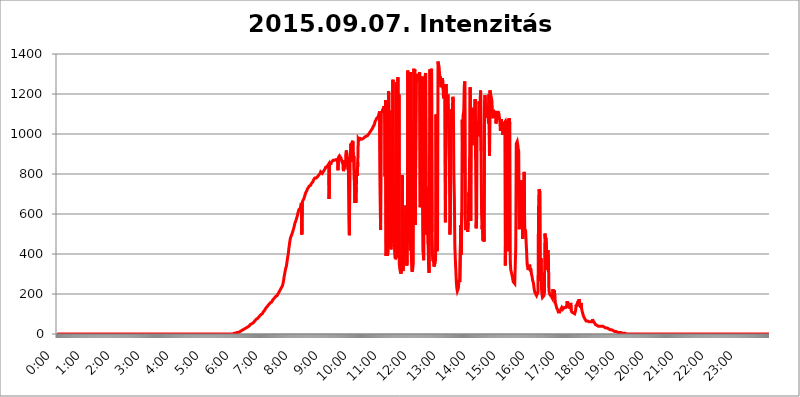
| Category | 2015.09.07. Intenzitás [W/m^2] |
|---|---|
| 0.0 | 0 |
| 0.0006944444444444445 | 0 |
| 0.001388888888888889 | 0 |
| 0.0020833333333333333 | 0 |
| 0.002777777777777778 | 0 |
| 0.003472222222222222 | 0 |
| 0.004166666666666667 | 0 |
| 0.004861111111111111 | 0 |
| 0.005555555555555556 | 0 |
| 0.0062499999999999995 | 0 |
| 0.006944444444444444 | 0 |
| 0.007638888888888889 | 0 |
| 0.008333333333333333 | 0 |
| 0.009027777777777779 | 0 |
| 0.009722222222222222 | 0 |
| 0.010416666666666666 | 0 |
| 0.011111111111111112 | 0 |
| 0.011805555555555555 | 0 |
| 0.012499999999999999 | 0 |
| 0.013194444444444444 | 0 |
| 0.013888888888888888 | 0 |
| 0.014583333333333332 | 0 |
| 0.015277777777777777 | 0 |
| 0.015972222222222224 | 0 |
| 0.016666666666666666 | 0 |
| 0.017361111111111112 | 0 |
| 0.018055555555555557 | 0 |
| 0.01875 | 0 |
| 0.019444444444444445 | 0 |
| 0.02013888888888889 | 0 |
| 0.020833333333333332 | 0 |
| 0.02152777777777778 | 0 |
| 0.022222222222222223 | 0 |
| 0.02291666666666667 | 0 |
| 0.02361111111111111 | 0 |
| 0.024305555555555556 | 0 |
| 0.024999999999999998 | 0 |
| 0.025694444444444447 | 0 |
| 0.02638888888888889 | 0 |
| 0.027083333333333334 | 0 |
| 0.027777777777777776 | 0 |
| 0.02847222222222222 | 0 |
| 0.029166666666666664 | 0 |
| 0.029861111111111113 | 0 |
| 0.030555555555555555 | 0 |
| 0.03125 | 0 |
| 0.03194444444444445 | 0 |
| 0.03263888888888889 | 0 |
| 0.03333333333333333 | 0 |
| 0.034027777777777775 | 0 |
| 0.034722222222222224 | 0 |
| 0.035416666666666666 | 0 |
| 0.036111111111111115 | 0 |
| 0.03680555555555556 | 0 |
| 0.0375 | 0 |
| 0.03819444444444444 | 0 |
| 0.03888888888888889 | 0 |
| 0.03958333333333333 | 0 |
| 0.04027777777777778 | 0 |
| 0.04097222222222222 | 0 |
| 0.041666666666666664 | 0 |
| 0.042361111111111106 | 0 |
| 0.04305555555555556 | 0 |
| 0.043750000000000004 | 0 |
| 0.044444444444444446 | 0 |
| 0.04513888888888889 | 0 |
| 0.04583333333333334 | 0 |
| 0.04652777777777778 | 0 |
| 0.04722222222222222 | 0 |
| 0.04791666666666666 | 0 |
| 0.04861111111111111 | 0 |
| 0.049305555555555554 | 0 |
| 0.049999999999999996 | 0 |
| 0.05069444444444445 | 0 |
| 0.051388888888888894 | 0 |
| 0.052083333333333336 | 0 |
| 0.05277777777777778 | 0 |
| 0.05347222222222222 | 0 |
| 0.05416666666666667 | 0 |
| 0.05486111111111111 | 0 |
| 0.05555555555555555 | 0 |
| 0.05625 | 0 |
| 0.05694444444444444 | 0 |
| 0.057638888888888885 | 0 |
| 0.05833333333333333 | 0 |
| 0.05902777777777778 | 0 |
| 0.059722222222222225 | 0 |
| 0.06041666666666667 | 0 |
| 0.061111111111111116 | 0 |
| 0.06180555555555556 | 0 |
| 0.0625 | 0 |
| 0.06319444444444444 | 0 |
| 0.06388888888888888 | 0 |
| 0.06458333333333334 | 0 |
| 0.06527777777777778 | 0 |
| 0.06597222222222222 | 0 |
| 0.06666666666666667 | 0 |
| 0.06736111111111111 | 0 |
| 0.06805555555555555 | 0 |
| 0.06874999999999999 | 0 |
| 0.06944444444444443 | 0 |
| 0.07013888888888889 | 0 |
| 0.07083333333333333 | 0 |
| 0.07152777777777779 | 0 |
| 0.07222222222222223 | 0 |
| 0.07291666666666667 | 0 |
| 0.07361111111111111 | 0 |
| 0.07430555555555556 | 0 |
| 0.075 | 0 |
| 0.07569444444444444 | 0 |
| 0.0763888888888889 | 0 |
| 0.07708333333333334 | 0 |
| 0.07777777777777778 | 0 |
| 0.07847222222222222 | 0 |
| 0.07916666666666666 | 0 |
| 0.0798611111111111 | 0 |
| 0.08055555555555556 | 0 |
| 0.08125 | 0 |
| 0.08194444444444444 | 0 |
| 0.08263888888888889 | 0 |
| 0.08333333333333333 | 0 |
| 0.08402777777777777 | 0 |
| 0.08472222222222221 | 0 |
| 0.08541666666666665 | 0 |
| 0.08611111111111112 | 0 |
| 0.08680555555555557 | 0 |
| 0.08750000000000001 | 0 |
| 0.08819444444444445 | 0 |
| 0.08888888888888889 | 0 |
| 0.08958333333333333 | 0 |
| 0.09027777777777778 | 0 |
| 0.09097222222222222 | 0 |
| 0.09166666666666667 | 0 |
| 0.09236111111111112 | 0 |
| 0.09305555555555556 | 0 |
| 0.09375 | 0 |
| 0.09444444444444444 | 0 |
| 0.09513888888888888 | 0 |
| 0.09583333333333333 | 0 |
| 0.09652777777777777 | 0 |
| 0.09722222222222222 | 0 |
| 0.09791666666666667 | 0 |
| 0.09861111111111111 | 0 |
| 0.09930555555555555 | 0 |
| 0.09999999999999999 | 0 |
| 0.10069444444444443 | 0 |
| 0.1013888888888889 | 0 |
| 0.10208333333333335 | 0 |
| 0.10277777777777779 | 0 |
| 0.10347222222222223 | 0 |
| 0.10416666666666667 | 0 |
| 0.10486111111111111 | 0 |
| 0.10555555555555556 | 0 |
| 0.10625 | 0 |
| 0.10694444444444444 | 0 |
| 0.1076388888888889 | 0 |
| 0.10833333333333334 | 0 |
| 0.10902777777777778 | 0 |
| 0.10972222222222222 | 0 |
| 0.1111111111111111 | 0 |
| 0.11180555555555556 | 0 |
| 0.11180555555555556 | 0 |
| 0.1125 | 0 |
| 0.11319444444444444 | 0 |
| 0.11388888888888889 | 0 |
| 0.11458333333333333 | 0 |
| 0.11527777777777777 | 0 |
| 0.11597222222222221 | 0 |
| 0.11666666666666665 | 0 |
| 0.1173611111111111 | 0 |
| 0.11805555555555557 | 0 |
| 0.11944444444444445 | 0 |
| 0.12013888888888889 | 0 |
| 0.12083333333333333 | 0 |
| 0.12152777777777778 | 0 |
| 0.12222222222222223 | 0 |
| 0.12291666666666667 | 0 |
| 0.12291666666666667 | 0 |
| 0.12361111111111112 | 0 |
| 0.12430555555555556 | 0 |
| 0.125 | 0 |
| 0.12569444444444444 | 0 |
| 0.12638888888888888 | 0 |
| 0.12708333333333333 | 0 |
| 0.16875 | 0 |
| 0.12847222222222224 | 0 |
| 0.12916666666666668 | 0 |
| 0.12986111111111112 | 0 |
| 0.13055555555555556 | 0 |
| 0.13125 | 0 |
| 0.13194444444444445 | 0 |
| 0.1326388888888889 | 0 |
| 0.13333333333333333 | 0 |
| 0.13402777777777777 | 0 |
| 0.13402777777777777 | 0 |
| 0.13472222222222222 | 0 |
| 0.13541666666666666 | 0 |
| 0.1361111111111111 | 0 |
| 0.13749999999999998 | 0 |
| 0.13819444444444443 | 0 |
| 0.1388888888888889 | 0 |
| 0.13958333333333334 | 0 |
| 0.14027777777777778 | 0 |
| 0.14097222222222222 | 0 |
| 0.14166666666666666 | 0 |
| 0.1423611111111111 | 0 |
| 0.14305555555555557 | 0 |
| 0.14375000000000002 | 0 |
| 0.14444444444444446 | 0 |
| 0.1451388888888889 | 0 |
| 0.1451388888888889 | 0 |
| 0.14652777777777778 | 0 |
| 0.14722222222222223 | 0 |
| 0.14791666666666667 | 0 |
| 0.1486111111111111 | 0 |
| 0.14930555555555555 | 0 |
| 0.15 | 0 |
| 0.15069444444444444 | 0 |
| 0.15138888888888888 | 0 |
| 0.15208333333333332 | 0 |
| 0.15277777777777776 | 0 |
| 0.15347222222222223 | 0 |
| 0.15416666666666667 | 0 |
| 0.15486111111111112 | 0 |
| 0.15555555555555556 | 0 |
| 0.15625 | 0 |
| 0.15694444444444444 | 0 |
| 0.15763888888888888 | 0 |
| 0.15833333333333333 | 0 |
| 0.15902777777777777 | 0 |
| 0.15972222222222224 | 0 |
| 0.16041666666666668 | 0 |
| 0.16111111111111112 | 0 |
| 0.16180555555555556 | 0 |
| 0.1625 | 0 |
| 0.16319444444444445 | 0 |
| 0.1638888888888889 | 0 |
| 0.16458333333333333 | 0 |
| 0.16527777777777777 | 0 |
| 0.16597222222222222 | 0 |
| 0.16666666666666666 | 0 |
| 0.1673611111111111 | 0 |
| 0.16805555555555554 | 0 |
| 0.16874999999999998 | 0 |
| 0.16944444444444443 | 0 |
| 0.17013888888888887 | 0 |
| 0.1708333333333333 | 0 |
| 0.17152777777777775 | 0 |
| 0.17222222222222225 | 0 |
| 0.1729166666666667 | 0 |
| 0.17361111111111113 | 0 |
| 0.17430555555555557 | 0 |
| 0.17500000000000002 | 0 |
| 0.17569444444444446 | 0 |
| 0.1763888888888889 | 0 |
| 0.17708333333333334 | 0 |
| 0.17777777777777778 | 0 |
| 0.17847222222222223 | 0 |
| 0.17916666666666667 | 0 |
| 0.1798611111111111 | 0 |
| 0.18055555555555555 | 0 |
| 0.18125 | 0 |
| 0.18194444444444444 | 0 |
| 0.1826388888888889 | 0 |
| 0.18333333333333335 | 0 |
| 0.1840277777777778 | 0 |
| 0.18472222222222223 | 0 |
| 0.18541666666666667 | 0 |
| 0.18611111111111112 | 0 |
| 0.18680555555555556 | 0 |
| 0.1875 | 0 |
| 0.18819444444444444 | 0 |
| 0.18888888888888888 | 0 |
| 0.18958333333333333 | 0 |
| 0.19027777777777777 | 0 |
| 0.1909722222222222 | 0 |
| 0.19166666666666665 | 0 |
| 0.19236111111111112 | 0 |
| 0.19305555555555554 | 0 |
| 0.19375 | 0 |
| 0.19444444444444445 | 0 |
| 0.1951388888888889 | 0 |
| 0.19583333333333333 | 0 |
| 0.19652777777777777 | 0 |
| 0.19722222222222222 | 0 |
| 0.19791666666666666 | 0 |
| 0.1986111111111111 | 0 |
| 0.19930555555555554 | 0 |
| 0.19999999999999998 | 0 |
| 0.20069444444444443 | 0 |
| 0.20138888888888887 | 0 |
| 0.2020833333333333 | 0 |
| 0.2027777777777778 | 0 |
| 0.2034722222222222 | 0 |
| 0.2041666666666667 | 0 |
| 0.20486111111111113 | 0 |
| 0.20555555555555557 | 0 |
| 0.20625000000000002 | 0 |
| 0.20694444444444446 | 0 |
| 0.2076388888888889 | 0 |
| 0.20833333333333334 | 0 |
| 0.20902777777777778 | 0 |
| 0.20972222222222223 | 0 |
| 0.21041666666666667 | 0 |
| 0.2111111111111111 | 0 |
| 0.21180555555555555 | 0 |
| 0.2125 | 0 |
| 0.21319444444444444 | 0 |
| 0.2138888888888889 | 0 |
| 0.21458333333333335 | 0 |
| 0.2152777777777778 | 0 |
| 0.21597222222222223 | 0 |
| 0.21666666666666667 | 0 |
| 0.21736111111111112 | 0 |
| 0.21805555555555556 | 0 |
| 0.21875 | 0 |
| 0.21944444444444444 | 0 |
| 0.22013888888888888 | 0 |
| 0.22083333333333333 | 0 |
| 0.22152777777777777 | 0 |
| 0.2222222222222222 | 0 |
| 0.22291666666666665 | 0 |
| 0.2236111111111111 | 0 |
| 0.22430555555555556 | 0 |
| 0.225 | 0 |
| 0.22569444444444445 | 0 |
| 0.2263888888888889 | 0 |
| 0.22708333333333333 | 0 |
| 0.22777777777777777 | 0 |
| 0.22847222222222222 | 0 |
| 0.22916666666666666 | 0 |
| 0.2298611111111111 | 0 |
| 0.23055555555555554 | 0 |
| 0.23124999999999998 | 0 |
| 0.23194444444444443 | 0 |
| 0.23263888888888887 | 0 |
| 0.2333333333333333 | 0 |
| 0.2340277777777778 | 0 |
| 0.2347222222222222 | 0 |
| 0.2354166666666667 | 0 |
| 0.23611111111111113 | 0 |
| 0.23680555555555557 | 0 |
| 0.23750000000000002 | 0 |
| 0.23819444444444446 | 0 |
| 0.2388888888888889 | 0 |
| 0.23958333333333334 | 0 |
| 0.24027777777777778 | 0 |
| 0.24097222222222223 | 0 |
| 0.24166666666666667 | 0 |
| 0.2423611111111111 | 0 |
| 0.24305555555555555 | 0 |
| 0.24375 | 0 |
| 0.24444444444444446 | 0 |
| 0.24513888888888888 | 0 |
| 0.24583333333333335 | 0 |
| 0.2465277777777778 | 3.525 |
| 0.24722222222222223 | 0 |
| 0.24791666666666667 | 3.525 |
| 0.24861111111111112 | 3.525 |
| 0.24930555555555556 | 3.525 |
| 0.25 | 3.525 |
| 0.25069444444444444 | 3.525 |
| 0.2513888888888889 | 3.525 |
| 0.2520833333333333 | 7.887 |
| 0.25277777777777777 | 7.887 |
| 0.2534722222222222 | 7.887 |
| 0.25416666666666665 | 7.887 |
| 0.2548611111111111 | 12.257 |
| 0.2555555555555556 | 12.257 |
| 0.25625000000000003 | 12.257 |
| 0.2569444444444445 | 12.257 |
| 0.2576388888888889 | 12.257 |
| 0.25833333333333336 | 16.636 |
| 0.2590277777777778 | 16.636 |
| 0.25972222222222224 | 16.636 |
| 0.2604166666666667 | 21.024 |
| 0.2611111111111111 | 21.024 |
| 0.26180555555555557 | 21.024 |
| 0.2625 | 25.419 |
| 0.26319444444444445 | 25.419 |
| 0.2638888888888889 | 29.823 |
| 0.26458333333333334 | 29.823 |
| 0.2652777777777778 | 29.823 |
| 0.2659722222222222 | 29.823 |
| 0.26666666666666666 | 34.234 |
| 0.2673611111111111 | 34.234 |
| 0.26805555555555555 | 38.653 |
| 0.26875 | 38.653 |
| 0.26944444444444443 | 43.079 |
| 0.2701388888888889 | 43.079 |
| 0.2708333333333333 | 47.511 |
| 0.27152777777777776 | 47.511 |
| 0.2722222222222222 | 47.511 |
| 0.27291666666666664 | 51.951 |
| 0.2736111111111111 | 56.398 |
| 0.2743055555555555 | 56.398 |
| 0.27499999999999997 | 56.398 |
| 0.27569444444444446 | 60.85 |
| 0.27638888888888885 | 60.85 |
| 0.27708333333333335 | 65.31 |
| 0.2777777777777778 | 65.31 |
| 0.27847222222222223 | 69.775 |
| 0.2791666666666667 | 74.246 |
| 0.2798611111111111 | 74.246 |
| 0.28055555555555556 | 78.722 |
| 0.28125 | 78.722 |
| 0.28194444444444444 | 83.205 |
| 0.2826388888888889 | 83.205 |
| 0.2833333333333333 | 87.692 |
| 0.28402777777777777 | 87.692 |
| 0.2847222222222222 | 92.184 |
| 0.28541666666666665 | 96.682 |
| 0.28611111111111115 | 96.682 |
| 0.28680555555555554 | 101.184 |
| 0.28750000000000003 | 101.184 |
| 0.2881944444444445 | 105.69 |
| 0.2888888888888889 | 110.201 |
| 0.28958333333333336 | 110.201 |
| 0.2902777777777778 | 114.716 |
| 0.29097222222222224 | 119.235 |
| 0.2916666666666667 | 123.758 |
| 0.2923611111111111 | 128.284 |
| 0.29305555555555557 | 128.284 |
| 0.29375 | 132.814 |
| 0.29444444444444445 | 137.347 |
| 0.2951388888888889 | 137.347 |
| 0.29583333333333334 | 141.884 |
| 0.2965277777777778 | 146.423 |
| 0.2972222222222222 | 146.423 |
| 0.29791666666666666 | 150.964 |
| 0.2986111111111111 | 155.509 |
| 0.29930555555555555 | 155.509 |
| 0.3 | 160.056 |
| 0.30069444444444443 | 160.056 |
| 0.3013888888888889 | 164.605 |
| 0.3020833333333333 | 169.156 |
| 0.30277777777777776 | 169.156 |
| 0.3034722222222222 | 173.709 |
| 0.30416666666666664 | 178.264 |
| 0.3048611111111111 | 182.82 |
| 0.3055555555555555 | 182.82 |
| 0.30624999999999997 | 187.378 |
| 0.3069444444444444 | 191.937 |
| 0.3076388888888889 | 191.937 |
| 0.30833333333333335 | 191.937 |
| 0.3090277777777778 | 196.497 |
| 0.30972222222222223 | 201.058 |
| 0.3104166666666667 | 205.62 |
| 0.3111111111111111 | 210.182 |
| 0.31180555555555556 | 214.746 |
| 0.3125 | 219.309 |
| 0.31319444444444444 | 223.873 |
| 0.3138888888888889 | 228.436 |
| 0.3145833333333333 | 228.436 |
| 0.31527777777777777 | 233 |
| 0.3159722222222222 | 242.127 |
| 0.31666666666666665 | 246.689 |
| 0.31736111111111115 | 264.932 |
| 0.31805555555555554 | 283.156 |
| 0.31875000000000003 | 296.808 |
| 0.3194444444444445 | 310.44 |
| 0.3201388888888889 | 324.052 |
| 0.32083333333333336 | 333.113 |
| 0.3215277777777778 | 342.162 |
| 0.32222222222222224 | 360.221 |
| 0.3229166666666667 | 378.224 |
| 0.3236111111111111 | 391.685 |
| 0.32430555555555557 | 409.574 |
| 0.325 | 431.833 |
| 0.32569444444444445 | 449.551 |
| 0.3263888888888889 | 467.187 |
| 0.32708333333333334 | 480.356 |
| 0.3277777777777778 | 480.356 |
| 0.3284722222222222 | 493.475 |
| 0.32916666666666666 | 497.836 |
| 0.3298611111111111 | 506.542 |
| 0.33055555555555555 | 515.223 |
| 0.33125 | 519.555 |
| 0.33194444444444443 | 532.513 |
| 0.3326388888888889 | 536.82 |
| 0.3333333333333333 | 553.986 |
| 0.3340277777777778 | 558.261 |
| 0.3347222222222222 | 566.793 |
| 0.3354166666666667 | 575.299 |
| 0.3361111111111111 | 583.779 |
| 0.3368055555555556 | 592.233 |
| 0.33749999999999997 | 604.864 |
| 0.33819444444444446 | 613.252 |
| 0.33888888888888885 | 621.613 |
| 0.33958333333333335 | 625.784 |
| 0.34027777777777773 | 625.784 |
| 0.34097222222222223 | 629.948 |
| 0.3416666666666666 | 642.4 |
| 0.3423611111111111 | 654.791 |
| 0.3430555555555555 | 497.836 |
| 0.34375 | 658.909 |
| 0.3444444444444445 | 667.123 |
| 0.3451388888888889 | 671.22 |
| 0.3458333333333334 | 675.311 |
| 0.34652777777777777 | 683.473 |
| 0.34722222222222227 | 687.544 |
| 0.34791666666666665 | 699.717 |
| 0.34861111111111115 | 707.8 |
| 0.34930555555555554 | 707.8 |
| 0.35000000000000003 | 715.858 |
| 0.3506944444444444 | 723.889 |
| 0.3513888888888889 | 723.889 |
| 0.3520833333333333 | 731.896 |
| 0.3527777777777778 | 735.89 |
| 0.3534722222222222 | 739.877 |
| 0.3541666666666667 | 743.859 |
| 0.3548611111111111 | 743.859 |
| 0.35555555555555557 | 743.859 |
| 0.35625 | 751.803 |
| 0.35694444444444445 | 751.803 |
| 0.3576388888888889 | 755.766 |
| 0.35833333333333334 | 759.723 |
| 0.3590277777777778 | 763.674 |
| 0.3597222222222222 | 771.559 |
| 0.36041666666666666 | 775.492 |
| 0.3611111111111111 | 779.42 |
| 0.36180555555555555 | 775.492 |
| 0.3625 | 775.492 |
| 0.36319444444444443 | 779.42 |
| 0.3638888888888889 | 783.342 |
| 0.3645833333333333 | 783.342 |
| 0.3652777777777778 | 787.258 |
| 0.3659722222222222 | 791.169 |
| 0.3666666666666667 | 795.074 |
| 0.3673611111111111 | 798.974 |
| 0.3680555555555556 | 798.974 |
| 0.36874999999999997 | 802.868 |
| 0.36944444444444446 | 810.641 |
| 0.37013888888888885 | 806.757 |
| 0.37083333333333335 | 810.641 |
| 0.37152777777777773 | 802.868 |
| 0.37222222222222223 | 806.757 |
| 0.3729166666666666 | 810.641 |
| 0.3736111111111111 | 814.519 |
| 0.3743055555555555 | 818.392 |
| 0.375 | 822.26 |
| 0.3756944444444445 | 826.123 |
| 0.3763888888888889 | 833.834 |
| 0.3770833333333334 | 829.981 |
| 0.37777777777777777 | 829.981 |
| 0.37847222222222227 | 837.682 |
| 0.37916666666666665 | 837.682 |
| 0.37986111111111115 | 841.526 |
| 0.38055555555555554 | 849.199 |
| 0.38125000000000003 | 675.311 |
| 0.3819444444444444 | 853.029 |
| 0.3826388888888889 | 853.029 |
| 0.3833333333333333 | 853.029 |
| 0.3840277777777778 | 853.029 |
| 0.3847222222222222 | 860.676 |
| 0.3854166666666667 | 864.493 |
| 0.3861111111111111 | 864.493 |
| 0.38680555555555557 | 868.305 |
| 0.3875 | 868.305 |
| 0.38819444444444445 | 868.305 |
| 0.3888888888888889 | 868.305 |
| 0.38958333333333334 | 872.114 |
| 0.3902777777777778 | 872.114 |
| 0.3909722222222222 | 872.114 |
| 0.39166666666666666 | 872.114 |
| 0.3923611111111111 | 872.114 |
| 0.39305555555555555 | 872.114 |
| 0.39375 | 818.392 |
| 0.39444444444444443 | 883.516 |
| 0.3951388888888889 | 887.309 |
| 0.3958333333333333 | 891.099 |
| 0.3965277777777778 | 887.309 |
| 0.3972222222222222 | 887.309 |
| 0.3979166666666667 | 879.719 |
| 0.3986111111111111 | 883.516 |
| 0.3993055555555556 | 879.719 |
| 0.39999999999999997 | 853.029 |
| 0.40069444444444446 | 868.305 |
| 0.40138888888888885 | 814.519 |
| 0.40208333333333335 | 826.123 |
| 0.40277777777777773 | 849.199 |
| 0.40347222222222223 | 853.029 |
| 0.4041666666666666 | 841.526 |
| 0.4048611111111111 | 906.223 |
| 0.4055555555555555 | 917.534 |
| 0.40625 | 887.309 |
| 0.4069444444444445 | 887.309 |
| 0.4076388888888889 | 879.719 |
| 0.4083333333333334 | 826.123 |
| 0.40902777777777777 | 575.299 |
| 0.40972222222222227 | 493.475 |
| 0.41041666666666665 | 879.719 |
| 0.41111111111111115 | 902.447 |
| 0.41180555555555554 | 951.327 |
| 0.41250000000000003 | 860.676 |
| 0.4131944444444444 | 955.071 |
| 0.4138888888888889 | 955.071 |
| 0.4145833333333333 | 966.295 |
| 0.4152777777777778 | 864.493 |
| 0.4159722222222222 | 891.099 |
| 0.4166666666666667 | 771.559 |
| 0.4173611111111111 | 654.791 |
| 0.41805555555555557 | 723.889 |
| 0.41875 | 654.791 |
| 0.41944444444444445 | 735.89 |
| 0.4201388888888889 | 822.26 |
| 0.42083333333333334 | 791.169 |
| 0.4215277777777778 | 860.676 |
| 0.4222222222222222 | 977.508 |
| 0.42291666666666666 | 977.508 |
| 0.4236111111111111 | 970.034 |
| 0.42430555555555555 | 970.034 |
| 0.425 | 977.508 |
| 0.42569444444444443 | 977.508 |
| 0.4263888888888889 | 973.772 |
| 0.4270833333333333 | 973.772 |
| 0.4277777777777778 | 977.508 |
| 0.4284722222222222 | 977.508 |
| 0.4291666666666667 | 977.508 |
| 0.4298611111111111 | 977.508 |
| 0.4305555555555556 | 981.244 |
| 0.43124999999999997 | 984.98 |
| 0.43194444444444446 | 981.244 |
| 0.43263888888888885 | 984.98 |
| 0.43333333333333335 | 988.714 |
| 0.43402777777777773 | 988.714 |
| 0.43472222222222223 | 992.448 |
| 0.4354166666666666 | 992.448 |
| 0.4361111111111111 | 996.182 |
| 0.4368055555555555 | 999.916 |
| 0.4375 | 1003.65 |
| 0.4381944444444445 | 1007.383 |
| 0.4388888888888889 | 1011.118 |
| 0.4395833333333334 | 1014.852 |
| 0.44027777777777777 | 1018.587 |
| 0.44097222222222227 | 1022.323 |
| 0.44166666666666665 | 1026.06 |
| 0.44236111111111115 | 1029.798 |
| 0.44305555555555554 | 1037.277 |
| 0.44375000000000003 | 1041.019 |
| 0.4444444444444444 | 1044.762 |
| 0.4451388888888889 | 1052.255 |
| 0.4458333333333333 | 1063.51 |
| 0.4465277777777778 | 1059.756 |
| 0.4472222222222222 | 1071.027 |
| 0.4479166666666667 | 1078.555 |
| 0.4486111111111111 | 1074.789 |
| 0.44930555555555557 | 1078.555 |
| 0.45 | 1086.097 |
| 0.45069444444444445 | 1093.653 |
| 0.4513888888888889 | 1097.437 |
| 0.45208333333333334 | 1112.618 |
| 0.4527777777777778 | 1108.816 |
| 0.4534722222222222 | 519.555 |
| 0.45416666666666666 | 1105.019 |
| 0.4548611111111111 | 1105.019 |
| 0.45555555555555555 | 1112.618 |
| 0.45625 | 1120.238 |
| 0.45694444444444443 | 1120.238 |
| 0.4576388888888889 | 1127.879 |
| 0.4583333333333333 | 1139.384 |
| 0.4590277777777778 | 1097.437 |
| 0.4597222222222222 | 787.258 |
| 0.4604166666666667 | 1170.358 |
| 0.4611111111111111 | 391.685 |
| 0.4618055555555556 | 405.108 |
| 0.46249999999999997 | 445.129 |
| 0.46319444444444446 | 391.685 |
| 0.46388888888888885 | 418.492 |
| 0.46458333333333335 | 1213.804 |
| 0.46527777777777773 | 1197.876 |
| 0.46597222222222223 | 475.972 |
| 0.4666666666666666 | 1116.426 |
| 0.4673611111111111 | 440.702 |
| 0.4680555555555555 | 422.943 |
| 0.46875 | 462.786 |
| 0.4694444444444445 | 497.836 |
| 0.4701388888888889 | 484.735 |
| 0.4708333333333334 | 1270.964 |
| 0.47152777777777777 | 642.4 |
| 0.47222222222222227 | 484.735 |
| 0.47291666666666665 | 484.735 |
| 0.47361111111111115 | 387.202 |
| 0.47430555555555554 | 373.729 |
| 0.47500000000000003 | 382.715 |
| 0.4756944444444444 | 1258.511 |
| 0.4763888888888889 | 382.715 |
| 0.4770833333333333 | 409.574 |
| 0.4777777777777778 | 1283.541 |
| 0.4784722222222222 | 484.735 |
| 0.4791666666666667 | 1197.876 |
| 0.4798611111111111 | 346.682 |
| 0.48055555555555557 | 324.052 |
| 0.48125 | 310.44 |
| 0.48194444444444445 | 301.354 |
| 0.4826388888888889 | 296.808 |
| 0.48333333333333334 | 324.052 |
| 0.4840277777777778 | 795.074 |
| 0.4847222222222222 | 314.98 |
| 0.48541666666666666 | 333.113 |
| 0.4861111111111111 | 400.638 |
| 0.48680555555555555 | 510.885 |
| 0.4875 | 396.164 |
| 0.48819444444444443 | 545.416 |
| 0.4888888888888889 | 642.4 |
| 0.4895833333333333 | 378.224 |
| 0.4902777777777778 | 342.162 |
| 0.4909722222222222 | 369.23 |
| 0.4916666666666667 | 1317.736 |
| 0.4923611111111111 | 675.311 |
| 0.4930555555555556 | 462.786 |
| 0.49374999999999997 | 687.544 |
| 0.49444444444444446 | 480.356 |
| 0.49513888888888885 | 418.492 |
| 0.49583333333333335 | 1309.093 |
| 0.49652777777777773 | 414.035 |
| 0.49722222222222223 | 319.517 |
| 0.4979166666666666 | 310.44 |
| 0.4986111111111111 | 328.584 |
| 0.4993055555555555 | 351.198 |
| 0.5 | 1326.445 |
| 0.5006944444444444 | 1291.997 |
| 0.5013888888888889 | 1322.082 |
| 0.5020833333333333 | 545.416 |
| 0.5027777777777778 | 549.704 |
| 0.5034722222222222 | 1300.514 |
| 0.5041666666666667 | 1283.541 |
| 0.5048611111111111 | 1270.964 |
| 0.5055555555555555 | 1275.142 |
| 0.50625 | 1270.964 |
| 0.5069444444444444 | 1283.541 |
| 0.5076388888888889 | 1300.514 |
| 0.5083333333333333 | 1309.093 |
| 0.5090277777777777 | 634.105 |
| 0.5097222222222222 | 658.909 |
| 0.5104166666666666 | 1266.8 |
| 0.5111111111111112 | 1287.761 |
| 0.5118055555555555 | 1287.761 |
| 0.5125000000000001 | 1287.761 |
| 0.5131944444444444 | 409.574 |
| 0.513888888888889 | 369.23 |
| 0.5145833333333333 | 1275.142 |
| 0.5152777777777778 | 1283.541 |
| 0.5159722222222222 | 1291.997 |
| 0.5166666666666667 | 1304.795 |
| 0.517361111111111 | 604.864 |
| 0.5180555555555556 | 497.836 |
| 0.5187499999999999 | 634.105 |
| 0.5194444444444445 | 735.89 |
| 0.5201388888888888 | 449.551 |
| 0.5208333333333334 | 342.162 |
| 0.5215277777777778 | 305.898 |
| 0.5222222222222223 | 301.354 |
| 0.5229166666666667 | 1322.082 |
| 0.5236111111111111 | 1022.323 |
| 0.5243055555555556 | 1313.406 |
| 0.525 | 1326.445 |
| 0.5256944444444445 | 510.885 |
| 0.5263888888888889 | 387.202 |
| 0.5270833333333333 | 364.728 |
| 0.5277777777777778 | 387.202 |
| 0.5284722222222222 | 337.639 |
| 0.5291666666666667 | 337.639 |
| 0.5298611111111111 | 355.712 |
| 0.5305555555555556 | 369.23 |
| 0.53125 | 1097.437 |
| 0.5319444444444444 | 440.702 |
| 0.5326388888888889 | 414.035 |
| 0.5333333333333333 | 427.39 |
| 0.5340277777777778 | 1361.991 |
| 0.5347222222222222 | 1348.524 |
| 0.5354166666666667 | 1339.639 |
| 0.5361111111111111 | 1304.795 |
| 0.5368055555555555 | 1279.334 |
| 0.5375 | 1287.761 |
| 0.5381944444444444 | 1233.951 |
| 0.5388888888888889 | 1238.014 |
| 0.5395833333333333 | 1246.176 |
| 0.5402777777777777 | 1279.334 |
| 0.5409722222222222 | 1242.089 |
| 0.5416666666666666 | 1178.177 |
| 0.5423611111111112 | 1201.843 |
| 0.5430555555555555 | 1229.899 |
| 0.5437500000000001 | 1242.089 |
| 0.5444444444444444 | 558.261 |
| 0.545138888888889 | 1250.275 |
| 0.5458333333333333 | 1178.177 |
| 0.5465277777777778 | 1120.238 |
| 0.5472222222222222 | 1150.946 |
| 0.5479166666666667 | 1197.876 |
| 0.548611111111111 | 1074.789 |
| 0.5493055555555556 | 940.082 |
| 0.5499999999999999 | 860.676 |
| 0.5506944444444445 | 497.836 |
| 0.5513888888888888 | 592.233 |
| 0.5520833333333334 | 981.244 |
| 0.5527777777777778 | 1124.056 |
| 0.5534722222222223 | 1116.426 |
| 0.5541666666666667 | 1124.056 |
| 0.5548611111111111 | 1186.03 |
| 0.5555555555555556 | 1158.689 |
| 0.55625 | 798.974 |
| 0.5569444444444445 | 687.544 |
| 0.5576388888888889 | 440.702 |
| 0.5583333333333333 | 373.729 |
| 0.5590277777777778 | 319.517 |
| 0.5597222222222222 | 260.373 |
| 0.5604166666666667 | 228.436 |
| 0.5611111111111111 | 214.746 |
| 0.5618055555555556 | 214.746 |
| 0.5625 | 228.436 |
| 0.5631944444444444 | 255.813 |
| 0.5638888888888889 | 269.49 |
| 0.5645833333333333 | 260.373 |
| 0.5652777777777778 | 260.373 |
| 0.5659722222222222 | 545.416 |
| 0.5666666666666667 | 396.164 |
| 0.5673611111111111 | 609.062 |
| 0.5680555555555555 | 1071.027 |
| 0.56875 | 806.757 |
| 0.5694444444444444 | 1097.437 |
| 0.5701388888888889 | 1116.426 |
| 0.5708333333333333 | 1238.014 |
| 0.5715277777777777 | 1262.649 |
| 0.5722222222222222 | 596.45 |
| 0.5729166666666666 | 519.555 |
| 0.5736111111111112 | 519.555 |
| 0.5743055555555555 | 553.986 |
| 0.5750000000000001 | 536.82 |
| 0.5756944444444444 | 510.885 |
| 0.576388888888889 | 553.986 |
| 0.5770833333333333 | 707.8 |
| 0.5777777777777778 | 683.473 |
| 0.5784722222222222 | 879.719 |
| 0.5791666666666667 | 1233.951 |
| 0.579861111111111 | 566.793 |
| 0.5805555555555556 | 1131.708 |
| 0.5812499999999999 | 1022.323 |
| 0.5819444444444445 | 943.832 |
| 0.5826388888888888 | 1048.508 |
| 0.5833333333333334 | 1127.879 |
| 0.5840277777777778 | 1022.323 |
| 0.5847222222222223 | 1093.653 |
| 0.5854166666666667 | 996.182 |
| 0.5861111111111111 | 1174.263 |
| 0.5868055555555556 | 875.918 |
| 0.5875 | 528.2 |
| 0.5881944444444445 | 583.779 |
| 0.5888888888888889 | 1063.51 |
| 0.5895833333333333 | 1044.762 |
| 0.5902777777777778 | 1033.537 |
| 0.5909722222222222 | 988.714 |
| 0.5916666666666667 | 1162.571 |
| 0.5923611111111111 | 1139.384 |
| 0.5930555555555556 | 1154.814 |
| 0.59375 | 1217.812 |
| 0.5944444444444444 | 913.766 |
| 0.5951388888888889 | 604.864 |
| 0.5958333333333333 | 523.88 |
| 0.5965277777777778 | 558.261 |
| 0.5972222222222222 | 467.187 |
| 0.5979166666666667 | 532.513 |
| 0.5986111111111111 | 462.786 |
| 0.5993055555555555 | 1162.571 |
| 0.6 | 1193.918 |
| 0.6006944444444444 | 1124.056 |
| 0.6013888888888889 | 1089.873 |
| 0.6020833333333333 | 1082.324 |
| 0.6027777777777777 | 1143.232 |
| 0.6034722222222222 | 1147.086 |
| 0.6041666666666666 | 1086.097 |
| 0.6048611111111112 | 1052.255 |
| 0.6055555555555555 | 1197.876 |
| 0.6062500000000001 | 891.099 |
| 0.6069444444444444 | 1217.812 |
| 0.607638888888889 | 1201.843 |
| 0.6083333333333333 | 1197.876 |
| 0.6090277777777778 | 1178.177 |
| 0.6097222222222222 | 1162.571 |
| 0.6104166666666667 | 1093.653 |
| 0.611111111111111 | 1078.555 |
| 0.6118055555555556 | 1120.238 |
| 0.6124999999999999 | 1112.618 |
| 0.6131944444444445 | 1097.437 |
| 0.6138888888888888 | 1112.618 |
| 0.6145833333333334 | 1101.226 |
| 0.6152777777777778 | 1052.255 |
| 0.6159722222222223 | 1067.267 |
| 0.6166666666666667 | 1108.816 |
| 0.6173611111111111 | 1112.618 |
| 0.6180555555555556 | 1112.618 |
| 0.61875 | 1108.816 |
| 0.6194444444444445 | 1101.226 |
| 0.6201388888888889 | 1101.226 |
| 0.6208333333333333 | 1059.756 |
| 0.6215277777777778 | 1014.852 |
| 0.6222222222222222 | 1048.508 |
| 0.6229166666666667 | 1074.789 |
| 0.6236111111111111 | 1018.587 |
| 0.6243055555555556 | 1056.004 |
| 0.625 | 996.182 |
| 0.6256944444444444 | 1037.277 |
| 0.6263888888888889 | 1052.255 |
| 0.6270833333333333 | 1052.255 |
| 0.6277777777777778 | 1059.756 |
| 0.6284722222222222 | 342.162 |
| 0.6291666666666667 | 337.639 |
| 0.6298611111111111 | 1063.51 |
| 0.6305555555555555 | 1056.004 |
| 0.63125 | 767.62 |
| 0.6319444444444444 | 1067.267 |
| 0.6326388888888889 | 1074.789 |
| 0.6333333333333333 | 414.035 |
| 0.6340277777777777 | 1078.555 |
| 0.6347222222222222 | 1048.508 |
| 0.6354166666666666 | 360.221 |
| 0.6361111111111112 | 319.517 |
| 0.6368055555555555 | 310.44 |
| 0.6375000000000001 | 305.898 |
| 0.6381944444444444 | 287.709 |
| 0.638888888888889 | 274.047 |
| 0.6395833333333333 | 260.373 |
| 0.6402777777777778 | 260.373 |
| 0.6409722222222222 | 255.813 |
| 0.6416666666666667 | 251.251 |
| 0.642361111111111 | 251.251 |
| 0.6430555555555556 | 431.833 |
| 0.6437499999999999 | 951.327 |
| 0.6444444444444445 | 947.58 |
| 0.6451388888888888 | 962.555 |
| 0.6458333333333334 | 947.58 |
| 0.6465277777777778 | 928.819 |
| 0.6472222222222223 | 913.766 |
| 0.6479166666666667 | 523.88 |
| 0.6486111111111111 | 553.986 |
| 0.6493055555555556 | 646.537 |
| 0.65 | 562.53 |
| 0.6506944444444445 | 767.62 |
| 0.6513888888888889 | 600.661 |
| 0.6520833333333333 | 629.948 |
| 0.6527777777777778 | 475.972 |
| 0.6534722222222222 | 506.542 |
| 0.6541666666666667 | 695.666 |
| 0.6548611111111111 | 810.641 |
| 0.6555555555555556 | 528.2 |
| 0.65625 | 532.513 |
| 0.6569444444444444 | 515.223 |
| 0.6576388888888889 | 458.38 |
| 0.6583333333333333 | 409.574 |
| 0.6590277777777778 | 351.198 |
| 0.6597222222222222 | 351.198 |
| 0.6604166666666667 | 319.517 |
| 0.6611111111111111 | 324.052 |
| 0.6618055555555555 | 333.113 |
| 0.6625 | 346.682 |
| 0.6631944444444444 | 319.517 |
| 0.6638888888888889 | 328.584 |
| 0.6645833333333333 | 310.44 |
| 0.6652777777777777 | 296.808 |
| 0.6659722222222222 | 287.709 |
| 0.6666666666666666 | 269.49 |
| 0.6673611111111111 | 269.49 |
| 0.6680555555555556 | 251.251 |
| 0.6687500000000001 | 228.436 |
| 0.6694444444444444 | 214.746 |
| 0.6701388888888888 | 205.62 |
| 0.6708333333333334 | 201.058 |
| 0.6715277777777778 | 201.058 |
| 0.6722222222222222 | 191.937 |
| 0.6729166666666666 | 187.378 |
| 0.6736111111111112 | 191.937 |
| 0.6743055555555556 | 210.182 |
| 0.6749999999999999 | 617.436 |
| 0.6756944444444444 | 723.889 |
| 0.6763888888888889 | 719.877 |
| 0.6770833333333334 | 707.8 |
| 0.6777777777777777 | 264.932 |
| 0.6784722222222223 | 378.224 |
| 0.6791666666666667 | 228.436 |
| 0.6798611111111111 | 196.497 |
| 0.6805555555555555 | 182.82 |
| 0.68125 | 178.264 |
| 0.6819444444444445 | 182.82 |
| 0.6826388888888889 | 191.937 |
| 0.6833333333333332 | 210.182 |
| 0.6840277777777778 | 502.192 |
| 0.6847222222222222 | 471.582 |
| 0.6854166666666667 | 480.356 |
| 0.686111111111111 | 431.833 |
| 0.6868055555555556 | 319.517 |
| 0.6875 | 333.113 |
| 0.6881944444444444 | 418.492 |
| 0.688888888888889 | 369.23 |
| 0.6895833333333333 | 219.309 |
| 0.6902777777777778 | 205.62 |
| 0.6909722222222222 | 196.497 |
| 0.6916666666666668 | 201.058 |
| 0.6923611111111111 | 201.058 |
| 0.6930555555555555 | 187.378 |
| 0.69375 | 182.82 |
| 0.6944444444444445 | 178.264 |
| 0.6951388888888889 | 223.873 |
| 0.6958333333333333 | 201.058 |
| 0.6965277777777777 | 201.058 |
| 0.6972222222222223 | 219.309 |
| 0.6979166666666666 | 187.378 |
| 0.6986111111111111 | 155.509 |
| 0.6993055555555556 | 146.423 |
| 0.7000000000000001 | 137.347 |
| 0.7006944444444444 | 128.284 |
| 0.7013888888888888 | 123.758 |
| 0.7020833333333334 | 119.235 |
| 0.7027777777777778 | 110.201 |
| 0.7034722222222222 | 105.69 |
| 0.7041666666666666 | 105.69 |
| 0.7048611111111112 | 110.201 |
| 0.7055555555555556 | 114.716 |
| 0.7062499999999999 | 123.758 |
| 0.7069444444444444 | 128.284 |
| 0.7076388888888889 | 132.814 |
| 0.7083333333333334 | 128.284 |
| 0.7090277777777777 | 123.758 |
| 0.7097222222222223 | 128.284 |
| 0.7104166666666667 | 128.284 |
| 0.7111111111111111 | 132.814 |
| 0.7118055555555555 | 132.814 |
| 0.7125 | 128.284 |
| 0.7131944444444445 | 132.814 |
| 0.7138888888888889 | 132.814 |
| 0.7145833333333332 | 141.884 |
| 0.7152777777777778 | 164.605 |
| 0.7159722222222222 | 132.814 |
| 0.7166666666666667 | 128.284 |
| 0.717361111111111 | 146.423 |
| 0.7180555555555556 | 128.284 |
| 0.71875 | 123.758 |
| 0.7194444444444444 | 123.758 |
| 0.720138888888889 | 155.509 |
| 0.7208333333333333 | 119.235 |
| 0.7215277777777778 | 110.201 |
| 0.7222222222222222 | 110.201 |
| 0.7229166666666668 | 110.201 |
| 0.7236111111111111 | 105.69 |
| 0.7243055555555555 | 105.69 |
| 0.725 | 101.184 |
| 0.7256944444444445 | 101.184 |
| 0.7263888888888889 | 105.69 |
| 0.7270833333333333 | 119.235 |
| 0.7277777777777777 | 146.423 |
| 0.7284722222222223 | 137.347 |
| 0.7291666666666666 | 150.964 |
| 0.7298611111111111 | 155.509 |
| 0.7305555555555556 | 164.605 |
| 0.7312500000000001 | 141.884 |
| 0.7319444444444444 | 173.709 |
| 0.7326388888888888 | 146.423 |
| 0.7333333333333334 | 141.884 |
| 0.7340277777777778 | 132.814 |
| 0.7347222222222222 | 155.509 |
| 0.7354166666666666 | 128.284 |
| 0.7361111111111112 | 114.716 |
| 0.7368055555555556 | 105.69 |
| 0.7374999999999999 | 96.682 |
| 0.7381944444444444 | 87.692 |
| 0.7388888888888889 | 83.205 |
| 0.7395833333333334 | 78.722 |
| 0.7402777777777777 | 74.246 |
| 0.7409722222222223 | 74.246 |
| 0.7416666666666667 | 65.31 |
| 0.7423611111111111 | 65.31 |
| 0.7430555555555555 | 65.31 |
| 0.74375 | 65.31 |
| 0.7444444444444445 | 65.31 |
| 0.7451388888888889 | 65.31 |
| 0.7458333333333332 | 60.85 |
| 0.7465277777777778 | 60.85 |
| 0.7472222222222222 | 60.85 |
| 0.7479166666666667 | 60.85 |
| 0.748611111111111 | 60.85 |
| 0.7493055555555556 | 60.85 |
| 0.75 | 60.85 |
| 0.7506944444444444 | 74.246 |
| 0.751388888888889 | 65.31 |
| 0.7520833333333333 | 69.775 |
| 0.7527777777777778 | 69.775 |
| 0.7534722222222222 | 56.398 |
| 0.7541666666666668 | 51.951 |
| 0.7548611111111111 | 47.511 |
| 0.7555555555555555 | 47.511 |
| 0.75625 | 47.511 |
| 0.7569444444444445 | 43.079 |
| 0.7576388888888889 | 38.653 |
| 0.7583333333333333 | 38.653 |
| 0.7590277777777777 | 38.653 |
| 0.7597222222222223 | 38.653 |
| 0.7604166666666666 | 38.653 |
| 0.7611111111111111 | 38.653 |
| 0.7618055555555556 | 38.653 |
| 0.7625000000000001 | 38.653 |
| 0.7631944444444444 | 38.653 |
| 0.7638888888888888 | 38.653 |
| 0.7645833333333334 | 38.653 |
| 0.7652777777777778 | 38.653 |
| 0.7659722222222222 | 38.653 |
| 0.7666666666666666 | 38.653 |
| 0.7673611111111112 | 34.234 |
| 0.7680555555555556 | 34.234 |
| 0.7687499999999999 | 29.823 |
| 0.7694444444444444 | 29.823 |
| 0.7701388888888889 | 29.823 |
| 0.7708333333333334 | 29.823 |
| 0.7715277777777777 | 29.823 |
| 0.7722222222222223 | 29.823 |
| 0.7729166666666667 | 25.419 |
| 0.7736111111111111 | 25.419 |
| 0.7743055555555555 | 21.024 |
| 0.775 | 21.024 |
| 0.7756944444444445 | 21.024 |
| 0.7763888888888889 | 21.024 |
| 0.7770833333333332 | 21.024 |
| 0.7777777777777778 | 21.024 |
| 0.7784722222222222 | 16.636 |
| 0.7791666666666667 | 16.636 |
| 0.779861111111111 | 16.636 |
| 0.7805555555555556 | 16.636 |
| 0.78125 | 12.257 |
| 0.7819444444444444 | 12.257 |
| 0.782638888888889 | 12.257 |
| 0.7833333333333333 | 12.257 |
| 0.7840277777777778 | 12.257 |
| 0.7847222222222222 | 12.257 |
| 0.7854166666666668 | 12.257 |
| 0.7861111111111111 | 7.887 |
| 0.7868055555555555 | 7.887 |
| 0.7875 | 7.887 |
| 0.7881944444444445 | 7.887 |
| 0.7888888888888889 | 7.887 |
| 0.7895833333333333 | 7.887 |
| 0.7902777777777777 | 7.887 |
| 0.7909722222222223 | 3.525 |
| 0.7916666666666666 | 3.525 |
| 0.7923611111111111 | 3.525 |
| 0.7930555555555556 | 3.525 |
| 0.7937500000000001 | 3.525 |
| 0.7944444444444444 | 3.525 |
| 0.7951388888888888 | 3.525 |
| 0.7958333333333334 | 3.525 |
| 0.7965277777777778 | 3.525 |
| 0.7972222222222222 | 0 |
| 0.7979166666666666 | 0 |
| 0.7986111111111112 | 0 |
| 0.7993055555555556 | 0 |
| 0.7999999999999999 | 0 |
| 0.8006944444444444 | 0 |
| 0.8013888888888889 | 0 |
| 0.8020833333333334 | 0 |
| 0.8027777777777777 | 0 |
| 0.8034722222222223 | 0 |
| 0.8041666666666667 | 0 |
| 0.8048611111111111 | 0 |
| 0.8055555555555555 | 0 |
| 0.80625 | 0 |
| 0.8069444444444445 | 0 |
| 0.8076388888888889 | 0 |
| 0.8083333333333332 | 0 |
| 0.8090277777777778 | 0 |
| 0.8097222222222222 | 0 |
| 0.8104166666666667 | 0 |
| 0.811111111111111 | 0 |
| 0.8118055555555556 | 0 |
| 0.8125 | 0 |
| 0.8131944444444444 | 0 |
| 0.813888888888889 | 0 |
| 0.8145833333333333 | 0 |
| 0.8152777777777778 | 0 |
| 0.8159722222222222 | 0 |
| 0.8166666666666668 | 0 |
| 0.8173611111111111 | 0 |
| 0.8180555555555555 | 0 |
| 0.81875 | 0 |
| 0.8194444444444445 | 0 |
| 0.8201388888888889 | 0 |
| 0.8208333333333333 | 0 |
| 0.8215277777777777 | 0 |
| 0.8222222222222223 | 0 |
| 0.8229166666666666 | 0 |
| 0.8236111111111111 | 0 |
| 0.8243055555555556 | 0 |
| 0.8250000000000001 | 0 |
| 0.8256944444444444 | 0 |
| 0.8263888888888888 | 0 |
| 0.8270833333333334 | 0 |
| 0.8277777777777778 | 0 |
| 0.8284722222222222 | 0 |
| 0.8291666666666666 | 0 |
| 0.8298611111111112 | 0 |
| 0.8305555555555556 | 0 |
| 0.8312499999999999 | 0 |
| 0.8319444444444444 | 0 |
| 0.8326388888888889 | 0 |
| 0.8333333333333334 | 0 |
| 0.8340277777777777 | 0 |
| 0.8347222222222223 | 0 |
| 0.8354166666666667 | 0 |
| 0.8361111111111111 | 0 |
| 0.8368055555555555 | 0 |
| 0.8375 | 0 |
| 0.8381944444444445 | 0 |
| 0.8388888888888889 | 0 |
| 0.8395833333333332 | 0 |
| 0.8402777777777778 | 0 |
| 0.8409722222222222 | 0 |
| 0.8416666666666667 | 0 |
| 0.842361111111111 | 0 |
| 0.8430555555555556 | 0 |
| 0.84375 | 0 |
| 0.8444444444444444 | 0 |
| 0.845138888888889 | 0 |
| 0.8458333333333333 | 0 |
| 0.8465277777777778 | 0 |
| 0.8472222222222222 | 0 |
| 0.8479166666666668 | 0 |
| 0.8486111111111111 | 0 |
| 0.8493055555555555 | 0 |
| 0.85 | 0 |
| 0.8506944444444445 | 0 |
| 0.8513888888888889 | 0 |
| 0.8520833333333333 | 0 |
| 0.8527777777777777 | 0 |
| 0.8534722222222223 | 0 |
| 0.8541666666666666 | 0 |
| 0.8548611111111111 | 0 |
| 0.8555555555555556 | 0 |
| 0.8562500000000001 | 0 |
| 0.8569444444444444 | 0 |
| 0.8576388888888888 | 0 |
| 0.8583333333333334 | 0 |
| 0.8590277777777778 | 0 |
| 0.8597222222222222 | 0 |
| 0.8604166666666666 | 0 |
| 0.8611111111111112 | 0 |
| 0.8618055555555556 | 0 |
| 0.8624999999999999 | 0 |
| 0.8631944444444444 | 0 |
| 0.8638888888888889 | 0 |
| 0.8645833333333334 | 0 |
| 0.8652777777777777 | 0 |
| 0.8659722222222223 | 0 |
| 0.8666666666666667 | 0 |
| 0.8673611111111111 | 0 |
| 0.8680555555555555 | 0 |
| 0.86875 | 0 |
| 0.8694444444444445 | 0 |
| 0.8701388888888889 | 0 |
| 0.8708333333333332 | 0 |
| 0.8715277777777778 | 0 |
| 0.8722222222222222 | 0 |
| 0.8729166666666667 | 0 |
| 0.873611111111111 | 0 |
| 0.8743055555555556 | 0 |
| 0.875 | 0 |
| 0.8756944444444444 | 0 |
| 0.876388888888889 | 0 |
| 0.8770833333333333 | 0 |
| 0.8777777777777778 | 0 |
| 0.8784722222222222 | 0 |
| 0.8791666666666668 | 0 |
| 0.8798611111111111 | 0 |
| 0.8805555555555555 | 0 |
| 0.88125 | 0 |
| 0.8819444444444445 | 0 |
| 0.8826388888888889 | 0 |
| 0.8833333333333333 | 0 |
| 0.8840277777777777 | 0 |
| 0.8847222222222223 | 0 |
| 0.8854166666666666 | 0 |
| 0.8861111111111111 | 0 |
| 0.8868055555555556 | 0 |
| 0.8875000000000001 | 0 |
| 0.8881944444444444 | 0 |
| 0.8888888888888888 | 0 |
| 0.8895833333333334 | 0 |
| 0.8902777777777778 | 0 |
| 0.8909722222222222 | 0 |
| 0.8916666666666666 | 0 |
| 0.8923611111111112 | 0 |
| 0.8930555555555556 | 0 |
| 0.8937499999999999 | 0 |
| 0.8944444444444444 | 0 |
| 0.8951388888888889 | 0 |
| 0.8958333333333334 | 0 |
| 0.8965277777777777 | 0 |
| 0.8972222222222223 | 0 |
| 0.8979166666666667 | 0 |
| 0.8986111111111111 | 0 |
| 0.8993055555555555 | 0 |
| 0.9 | 0 |
| 0.9006944444444445 | 0 |
| 0.9013888888888889 | 0 |
| 0.9020833333333332 | 0 |
| 0.9027777777777778 | 0 |
| 0.9034722222222222 | 0 |
| 0.9041666666666667 | 0 |
| 0.904861111111111 | 0 |
| 0.9055555555555556 | 0 |
| 0.90625 | 0 |
| 0.9069444444444444 | 0 |
| 0.907638888888889 | 0 |
| 0.9083333333333333 | 0 |
| 0.9090277777777778 | 0 |
| 0.9097222222222222 | 0 |
| 0.9104166666666668 | 0 |
| 0.9111111111111111 | 0 |
| 0.9118055555555555 | 0 |
| 0.9125 | 0 |
| 0.9131944444444445 | 0 |
| 0.9138888888888889 | 0 |
| 0.9145833333333333 | 0 |
| 0.9152777777777777 | 0 |
| 0.9159722222222223 | 0 |
| 0.9166666666666666 | 0 |
| 0.9173611111111111 | 0 |
| 0.9180555555555556 | 0 |
| 0.9187500000000001 | 0 |
| 0.9194444444444444 | 0 |
| 0.9201388888888888 | 0 |
| 0.9208333333333334 | 0 |
| 0.9215277777777778 | 0 |
| 0.9222222222222222 | 0 |
| 0.9229166666666666 | 0 |
| 0.9236111111111112 | 0 |
| 0.9243055555555556 | 0 |
| 0.9249999999999999 | 0 |
| 0.9256944444444444 | 0 |
| 0.9263888888888889 | 0 |
| 0.9270833333333334 | 0 |
| 0.9277777777777777 | 0 |
| 0.9284722222222223 | 0 |
| 0.9291666666666667 | 0 |
| 0.9298611111111111 | 0 |
| 0.9305555555555555 | 0 |
| 0.93125 | 0 |
| 0.9319444444444445 | 0 |
| 0.9326388888888889 | 0 |
| 0.9333333333333332 | 0 |
| 0.9340277777777778 | 0 |
| 0.9347222222222222 | 0 |
| 0.9354166666666667 | 0 |
| 0.936111111111111 | 0 |
| 0.9368055555555556 | 0 |
| 0.9375 | 0 |
| 0.9381944444444444 | 0 |
| 0.938888888888889 | 0 |
| 0.9395833333333333 | 0 |
| 0.9402777777777778 | 0 |
| 0.9409722222222222 | 0 |
| 0.9416666666666668 | 0 |
| 0.9423611111111111 | 0 |
| 0.9430555555555555 | 0 |
| 0.94375 | 0 |
| 0.9444444444444445 | 0 |
| 0.9451388888888889 | 0 |
| 0.9458333333333333 | 0 |
| 0.9465277777777777 | 0 |
| 0.9472222222222223 | 0 |
| 0.9479166666666666 | 0 |
| 0.9486111111111111 | 0 |
| 0.9493055555555556 | 0 |
| 0.9500000000000001 | 0 |
| 0.9506944444444444 | 0 |
| 0.9513888888888888 | 0 |
| 0.9520833333333334 | 0 |
| 0.9527777777777778 | 0 |
| 0.9534722222222222 | 0 |
| 0.9541666666666666 | 0 |
| 0.9548611111111112 | 0 |
| 0.9555555555555556 | 0 |
| 0.9562499999999999 | 0 |
| 0.9569444444444444 | 0 |
| 0.9576388888888889 | 0 |
| 0.9583333333333334 | 0 |
| 0.9590277777777777 | 0 |
| 0.9597222222222223 | 0 |
| 0.9604166666666667 | 0 |
| 0.9611111111111111 | 0 |
| 0.9618055555555555 | 0 |
| 0.9625 | 0 |
| 0.9631944444444445 | 0 |
| 0.9638888888888889 | 0 |
| 0.9645833333333332 | 0 |
| 0.9652777777777778 | 0 |
| 0.9659722222222222 | 0 |
| 0.9666666666666667 | 0 |
| 0.967361111111111 | 0 |
| 0.9680555555555556 | 0 |
| 0.96875 | 0 |
| 0.9694444444444444 | 0 |
| 0.970138888888889 | 0 |
| 0.9708333333333333 | 0 |
| 0.9715277777777778 | 0 |
| 0.9722222222222222 | 0 |
| 0.9729166666666668 | 0 |
| 0.9736111111111111 | 0 |
| 0.9743055555555555 | 0 |
| 0.975 | 0 |
| 0.9756944444444445 | 0 |
| 0.9763888888888889 | 0 |
| 0.9770833333333333 | 0 |
| 0.9777777777777777 | 0 |
| 0.9784722222222223 | 0 |
| 0.9791666666666666 | 0 |
| 0.9798611111111111 | 0 |
| 0.9805555555555556 | 0 |
| 0.9812500000000001 | 0 |
| 0.9819444444444444 | 0 |
| 0.9826388888888888 | 0 |
| 0.9833333333333334 | 0 |
| 0.9840277777777778 | 0 |
| 0.9847222222222222 | 0 |
| 0.9854166666666666 | 0 |
| 0.9861111111111112 | 0 |
| 0.9868055555555556 | 0 |
| 0.9874999999999999 | 0 |
| 0.9881944444444444 | 0 |
| 0.9888888888888889 | 0 |
| 0.9895833333333334 | 0 |
| 0.9902777777777777 | 0 |
| 0.9909722222222223 | 0 |
| 0.9916666666666667 | 0 |
| 0.9923611111111111 | 0 |
| 0.9930555555555555 | 0 |
| 0.99375 | 0 |
| 0.9944444444444445 | 0 |
| 0.9951388888888889 | 0 |
| 0.9958333333333332 | 0 |
| 0.9965277777777778 | 0 |
| 0.9972222222222222 | 0 |
| 0.9979166666666667 | 0 |
| 0.998611111111111 | 0 |
| 0.9993055555555556 | 0 |